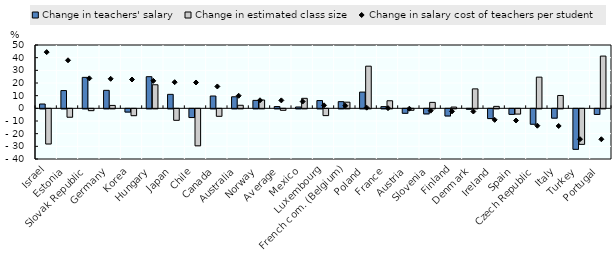
| Category | Change in teachers' salary | Change in estimated class size |
|---|---|---|
| Israel | 3.416 | -27.756 |
| Estonia | 14.024 | -6.62 |
| Slovak Republic | 24.452 | -1.428 |
| Germany | 14.208 | 2.304 |
| Korea | -2.547 | -5.403 |
| Hungary | 24.993 | 18.611 |
| Japan | 11.043 | -9.06 |
| Chile | -6.874 | -29.202 |
| Canada | 9.733 | -5.904 |
| Australia | 9.121 | 2.419 |
| Norway | 6.279 | 6.58 |
| Average | 1.418 | -1.161 |
| Mexico | 1.053 | 7.902 |
| Luxembourg | 6.136 | -5.347 |
| French com. (Belgium) | 5.279 | 4.862 |
| Poland | 12.829 | 33.28 |
| France | 1.354 | 5.98 |
| Austria | -3.517 | -1.134 |
| Slovenia | -3.994 | 4.694 |
| Finland | -5.636 | 1.012 |
| Denmark | -0.321 | 15.353 |
| Ireland | -7.689 | 1.549 |
| Spain | -4.383 | -4.137 |
| Czech Republic | -12.164 | 24.619 |
| Italy | -7.36 | 10.148 |
| Turkey | -31.981 | -28.043 |
| Portugal | -4.415 | 41.242 |